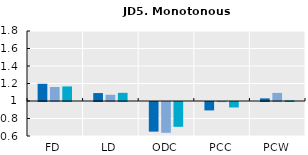
| Category | 2005 | 2010 | 2015 |
|---|---|---|---|
| FD | 1.197 | 1.16 | 1.166 |
| LD | 1.091 | 1.071 | 1.093 |
| ODC | 0.661 | 0.648 | 0.717 |
| PCC | 0.904 | 0.998 | 0.938 |
| PCW | 1.03 | 1.092 | 1.008 |